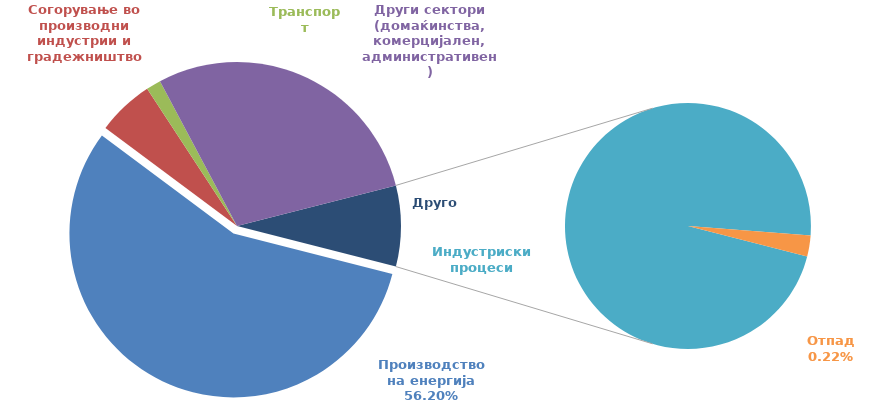
| Category | Ni [t] |
|---|---|
| 0 | 0.552 |
| 1 | 0.055 |
| 2 | 0.014 |
| 3 | 0.283 |
| 4 | 0.076 |
| 5 | 0.002 |